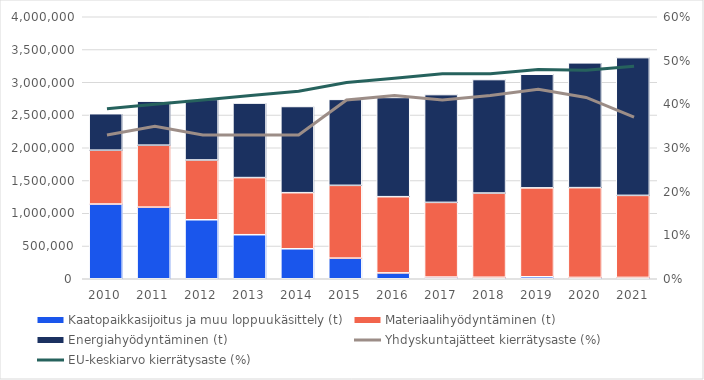
| Category | Kaatopaikkasijoitus ja muu loppuukäsittely (t) | Materiaalihyödyntäminen (t) | Energiahyödyntäminen (t) |
|---|---|---|---|
| 2010.0 | 1140721 | 822152 | 557131 |
| 2011.0 | 1093277 | 946234 | 672209 |
| 2012.0 | 900674 | 912596 | 924825 |
| 2013.0 | 672398 | 872210 | 1136939 |
| 2014.0 | 457733 | 856326 | 1315820 |
| 2015.0 | 314762 | 1111338 | 1312180 |
| 2016.0 | 89535 | 1163566 | 1514830 |
| 2017.0 | 25902 | 1140133 | 1645554 |
| 2018.0 | 22920.47 | 1285711 | 1732450.53 |
| 2019.0 | 30369 | 1357227 | 1735109 |
| 2020.0 | 20538 | 1370633 | 1904986 |
| 2021.0 | 20587 | 1252390 | 2103188 |